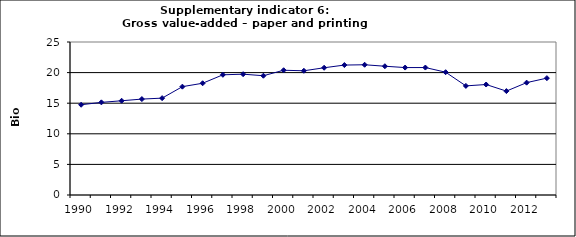
| Category | Gross value-added – paper and printing industry, Bio Euro (EC95) |
|---|---|
| 1990 | 14.749 |
| 1991 | 15.136 |
| 1992 | 15.4 |
| 1993 | 15.672 |
| 1994 | 15.828 |
| 1995 | 17.704 |
| 1996 | 18.258 |
| 1997 | 19.64 |
| 1998 | 19.743 |
| 1999 | 19.49 |
| 2000 | 20.386 |
| 2001 | 20.296 |
| 2002 | 20.791 |
| 2003 | 21.23 |
| 2004 | 21.28 |
| 2005 | 21.041 |
| 2006 | 20.821 |
| 2007 | 20.824 |
| 2008 | 20.066 |
| 2009 | 17.83 |
| 2010 | 18.051 |
| 2011 | 16.977 |
| 2012 | 18.36 |
| 2013 | 19.095 |